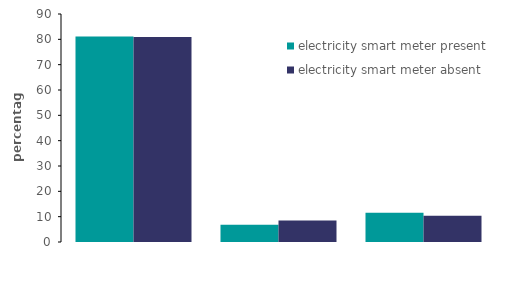
| Category | electricity smart meter present | electricity smart meter absent |
|---|---|---|
| direct debit | 81.098 | 80.873 |
| standard credit | 6.843 | 8.507 |
| pre-payment meter | 11.589 | 10.382 |